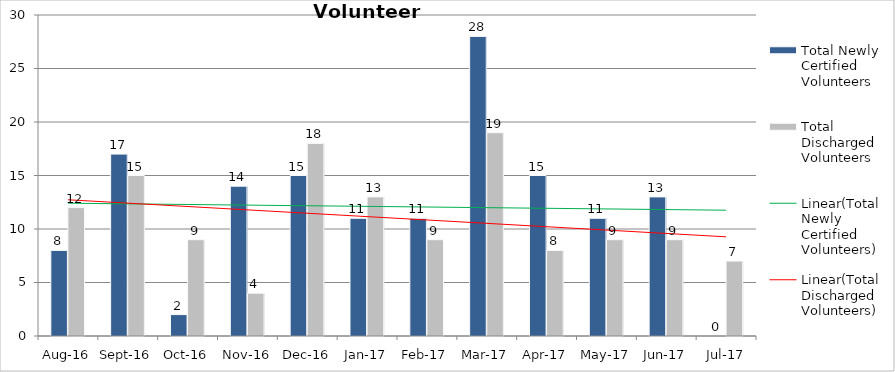
| Category | Total Newly Certified Volunteers | Total Discharged Volunteers |
|---|---|---|
| Aug-16 | 8 | 12 |
| Sep-16 | 17 | 15 |
| Oct-16 | 2 | 9 |
| Nov-16 | 14 | 4 |
| Dec-16 | 15 | 18 |
| Jan-17 | 11 | 13 |
| Feb-17 | 11 | 9 |
| Mar-17 | 28 | 19 |
| Apr-17 | 15 | 8 |
| May-17 | 11 | 9 |
| Jun-17 | 13 | 9 |
| Jul-17 | 0 | 7 |